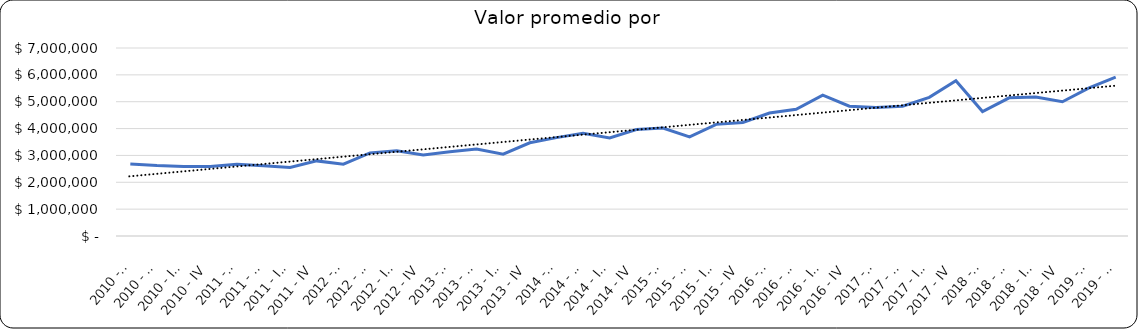
| Category | Valor m2 en Bogotá por sectores |
|---|---|
| 2010 - I | 2681647.94 |
| 2010 - II | 2621722.846 |
| 2010 - III | 2584269.663 |
| 2010 - IV | 2584269.663 |
| 2011 - I | 2670542.636 |
| 2011 - II | 2616279.07 |
| 2011 - III | 2555232.558 |
| 2011 - IV | 2796511.628 |
| 2012 - I | 2674418.605 |
| 2012 - II | 3094961.24 |
| 2012 - III | 3170542.636 |
| 2012 - IV | 3020387.597 |
| 2013 - I | 3140039.448 |
| 2013 - II | 3234714.004 |
| 2013 - III | 3047337.278 |
| 2013 - IV | 3471400.394 |
| 2014 - I | 3662848.119 |
| 2014 - II | 3824074.074 |
| 2014 - III | 3648148.148 |
| 2014 - IV | 3962962.963 |
| 2015 - I | 4021317.829 |
| 2015 - II | 3689922.481 |
| 2015 - III | 4156976.744 |
| 2015 - IV | 4224806.202 |
| 2016 - I | 4578754.579 |
| 2016 - II | 4717013.889 |
| 2016 - III | 5242592.593 |
| 2016 - IV | 4835164.835 |
| 2017 - I | 4787037.037 |
| 2017 - II | 4832713.755 |
| 2017 - III | 5164233.577 |
| 2017 - IV | 5778558.875 |
| 2018 - I | 4634146.341 |
| 2018 - II | 5144508.671 |
| 2018 - III | 5172414 |
| 2018 - IV | 5000000 |
| 2019 - I | 5517241 |
| 2019 - II | 5913978 |